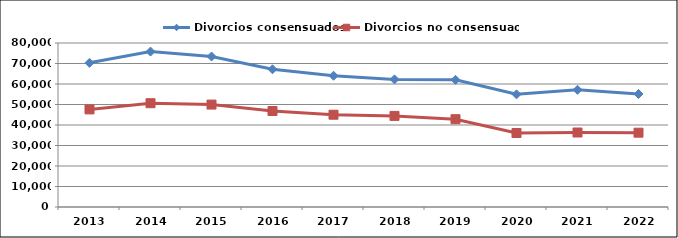
| Category | Divorcios consensuados | Divorcios no consensuados |
|---|---|---|
| 2013.0 | 70329 | 47611 |
| 2014.0 | 75820 | 50626 |
| 2015.0 | 73414 | 49963 |
| 2016.0 | 67189 | 46830 |
| 2017.0 | 64024 | 45019 |
| 2018.0 | 62241 | 44433 |
| 2019.0 | 62020 | 42826 |
| 2020.0 | 54960 | 36090 |
| 2021.0 | 57168 | 36337 |
| 2022.0 | 55126 | 36253 |